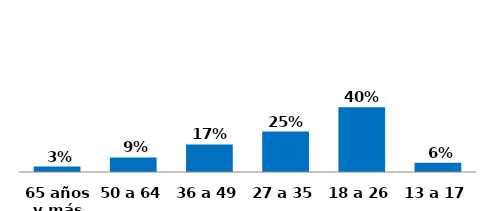
| Category | Series 0 |
|---|---|
| 13 a 17  | 0.057 |
| 18 a 26  | 0.4 |
| 27 a 35 | 0.25 |
| 36 a 49 | 0.17 |
| 50 a 64 | 0.09 |
| 65 años y más | 0.033 |